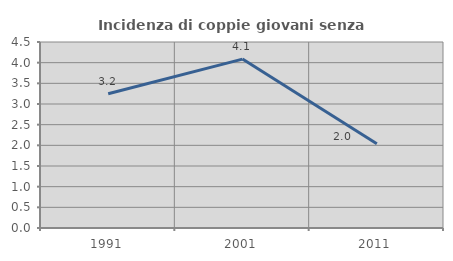
| Category | Incidenza di coppie giovani senza figli |
|---|---|
| 1991.0 | 3.248 |
| 2001.0 | 4.086 |
| 2011.0 | 2.038 |